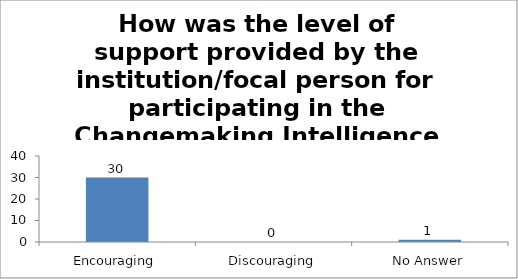
| Category | How was the level of support provided by the institution/focal person for participating in the Changemaking Intelligence Test? |
|---|---|
| Encouraging | 30 |
| Discouraging | 0 |
| No Answer | 1 |